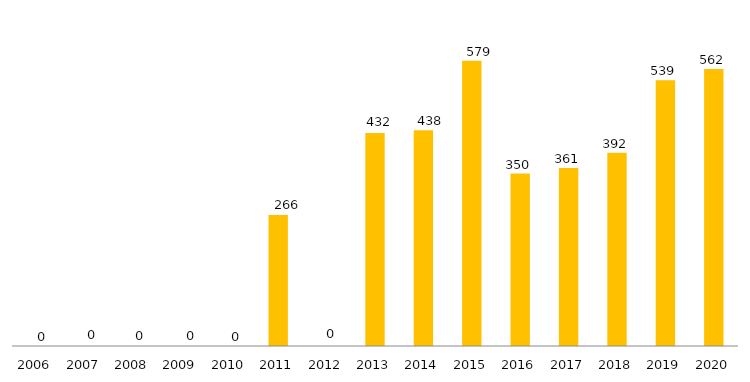
| Category | Andamento* |
|---|---|
| 2006.0 | 0 |
| 2007.0 | 0 |
| 2008.0 | 0 |
| 2009.0 | 0 |
| 2010.0 | 0 |
| 2011.0 | 266 |
| 2012.0 | 0 |
| 2013.0 | 432 |
| 2014.0 | 438 |
| 2015.0 | 579 |
| 2016.0 | 350 |
| 2017.0 | 361 |
| 2018.0 | 392 |
| 2019.0 | 539 |
| 2020.0 | 562 |